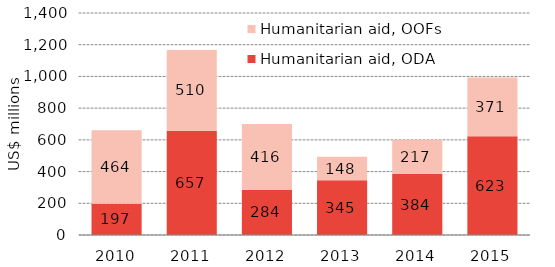
| Category | Humanitarian aid, ODA | Humanitarian aid, OOFs |
|---|---|---|
| 2010.0 | 196.761 | 464.242 |
| 2011.0 | 656.658 | 509.974 |
| 2012.0 | 284.25 | 416.141 |
| 2013.0 | 345.287 | 147.945 |
| 2014.0 | 384.158 | 217.167 |
| 2015.0 | 622.886 | 371.089 |